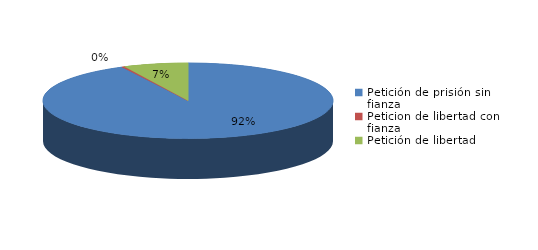
| Category | Series 0 |
|---|---|
| Petición de prisión sin fianza | 2344 |
| Peticion de libertad con fianza | 8 |
| Petición de libertad | 183 |